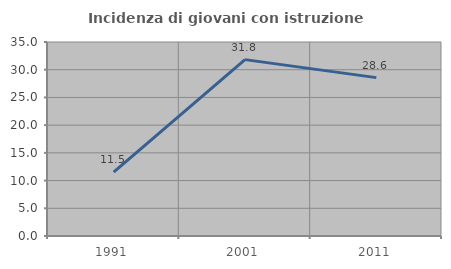
| Category | Incidenza di giovani con istruzione universitaria |
|---|---|
| 1991.0 | 11.538 |
| 2001.0 | 31.818 |
| 2011.0 | 28.571 |